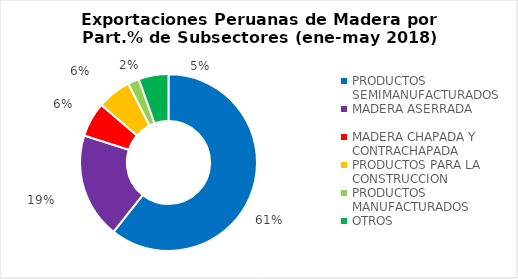
| Category | Part.% 2018 |
|---|---|
| PRODUCTOS SEMIMANUFACTURADOS | 0.607 |
| MADERA ASERRADA | 0.193 |
| MADERA CHAPADA Y CONTRACHAPADA | 0.063 |
| PRODUCTOS PARA LA CONSTRUCCION | 0.062 |
| PRODUCTOS MANUFACTURADOS | 0.021 |
| OTROS | 0.055 |